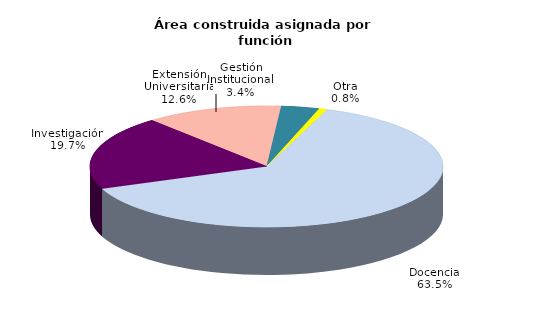
| Category | Series 0 |
|---|---|
| Docencia | 63.455 |
| Investigación | 19.734 |
| Extensión Universitaria | 12.575 |
| Gestión Institucional | 3.484 |
| Otra | 0.752 |